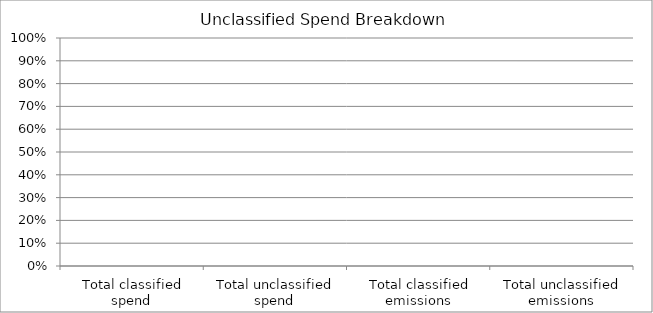
| Category | Series 0 |
|---|---|
| Total classified spend | 0 |
| Total unclassified spend | 0 |
| Total classified emissions | 0 |
| Total unclassified emissions | 0 |